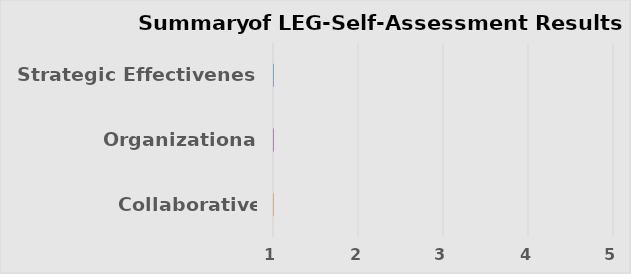
| Category | Series 0 |
|---|---|
| Collaborative Capacities | 0 |
| Organizational Capacities | 0 |
| Strategic Effectivenes | 0 |